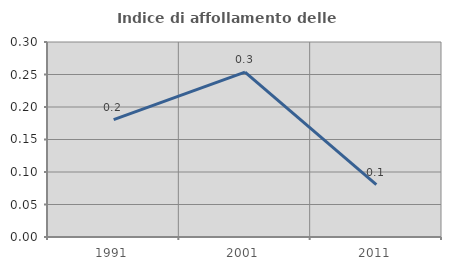
| Category | Indice di affollamento delle abitazioni  |
|---|---|
| 1991.0 | 0.181 |
| 2001.0 | 0.254 |
| 2011.0 | 0.081 |